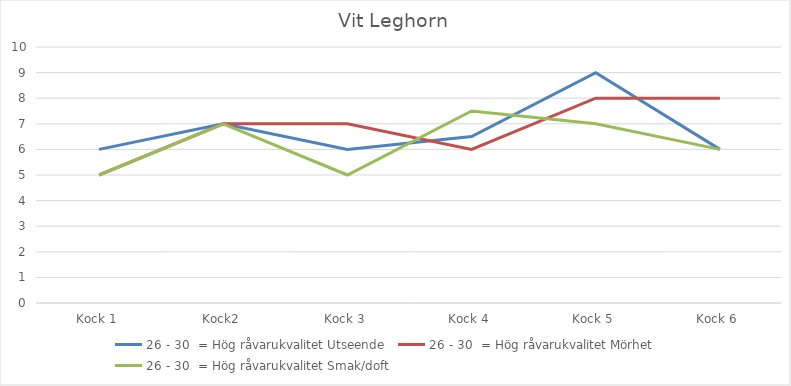
| Category | 26 - 30  = Hög råvarukvalitet Utseende | 26 - 30  = Hög råvarukvalitet Mörhet | 26 - 30  = Hög råvarukvalitet Smak/doft |
|---|---|---|---|
| Kock 1 | 6 | 5 | 5 |
| Kock2 | 7 | 7 | 7 |
| Kock 3 | 6 | 7 | 5 |
| Kock 4 | 6.5 | 6 | 7.5 |
| Kock 5 | 9 | 8 | 7 |
| Kock 6 | 6 | 8 | 6 |